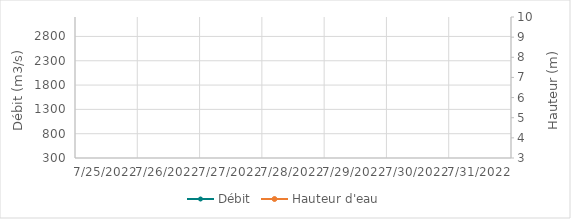
| Category | Débit |
|---|---|
| 4/26/22 | 2770.38 |
| 4/25/22 | 2883.07 |
| 4/24/22 | 3053.88 |
| 4/23/22 | 2913.33 |
| 4/22/22 | 2479.67 |
| 4/21/22 | 2250.75 |
| 4/20/22 | 2208.37 |